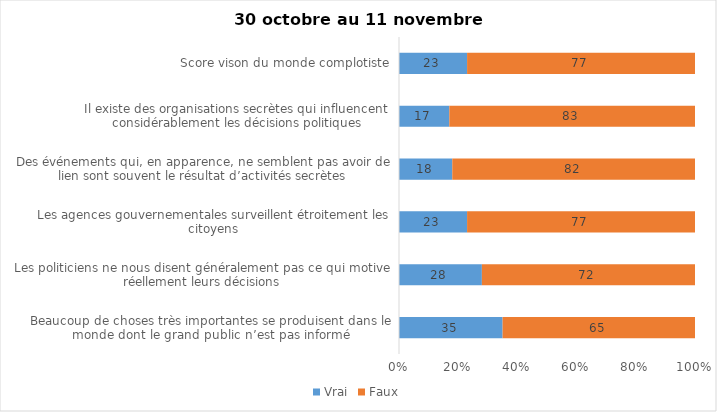
| Category | Vrai | Faux |
|---|---|---|
| Beaucoup de choses très importantes se produisent dans le monde dont le grand public n’est pas informé | 35 | 65 |
| Les politiciens ne nous disent généralement pas ce qui motive réellement leurs décisions | 28 | 72 |
| Les agences gouvernementales surveillent étroitement les citoyens | 23 | 77 |
| Des événements qui, en apparence, ne semblent pas avoir de lien sont souvent le résultat d’activités secrètes | 18 | 82 |
| Il existe des organisations secrètes qui influencent considérablement les décisions politiques | 17 | 83 |
| Score vison du monde complotiste | 23 | 77 |